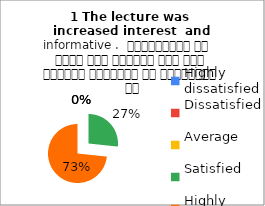
| Category | 1 The lecture was 
increased interest  and informative .  व्याख्यान से रुचि में वृद्धि हुई एवं शिक्षण जानकारी से परिपूर्ण था |
|---|---|
| Highly dissatisfied | 0 |
| Dissatisfied | 0 |
| Average | 0 |
| Satisfied | 4 |
| Highly satisfied | 11 |